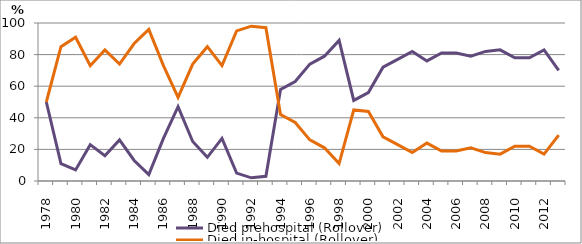
| Category | Died prehospital (Rollover) | Died in-hospital (Rollover) |
|---|---|---|
| 1978.0 | 50 | 50 |
| 1979.0 | 11 | 85 |
| 1980.0 | 7 | 91 |
| 1981.0 | 23 | 73 |
| 1982.0 | 16 | 83 |
| 1983.0 | 26 | 74 |
| 1984.0 | 13 | 87 |
| 1985.0 | 4 | 96 |
| 1986.0 | 27 | 73 |
| 1987.0 | 47 | 53 |
| 1988.0 | 25 | 74 |
| 1989.0 | 15 | 85 |
| 1990.0 | 27 | 73 |
| 1991.0 | 5 | 95 |
| 1992.0 | 2 | 98 |
| 1993.0 | 3 | 97 |
| 1994.0 | 58 | 42 |
| 1995.0 | 63 | 37 |
| 1996.0 | 74 | 26 |
| 1997.0 | 79 | 21 |
| 1998.0 | 89 | 11 |
| 1999.0 | 51 | 45 |
| 2000.0 | 56 | 44 |
| 2001.0 | 72 | 28 |
| 2002.0 | 77 | 23 |
| 2003.0 | 82 | 18 |
| 2004.0 | 76 | 24 |
| 2005.0 | 81 | 19 |
| 2006.0 | 81 | 19 |
| 2007.0 | 79 | 21 |
| 2008.0 | 82 | 18 |
| 2009.0 | 83 | 17 |
| 2010.0 | 78 | 22 |
| 2011.0 | 78 | 22 |
| 2012.0 | 83 | 17 |
| 2013.0 | 70 | 29 |